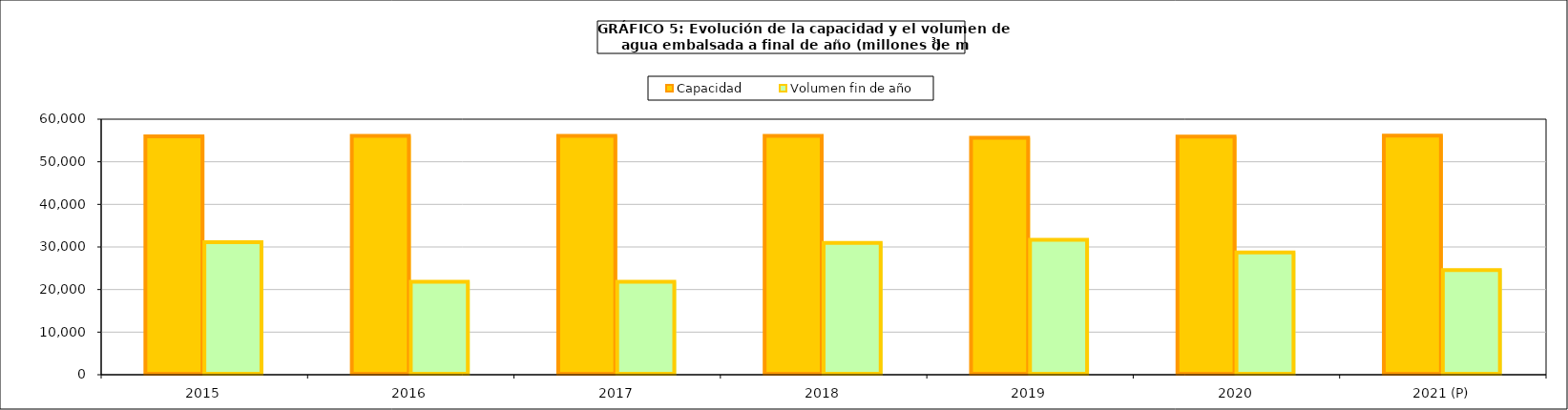
| Category | Capacidad | Volumen fin de año |
|---|---|---|
| 2015 | 55977 | 31121 |
| 2016 | 56075 | 21832 |
| 2017 | 56074 | 21832 |
| 2018 | 56074 | 30936 |
| 2019 | 55622 | 31678 |
| 2020 | 55899 | 28692 |
| 2021 (P) | 56136 | 24545 |